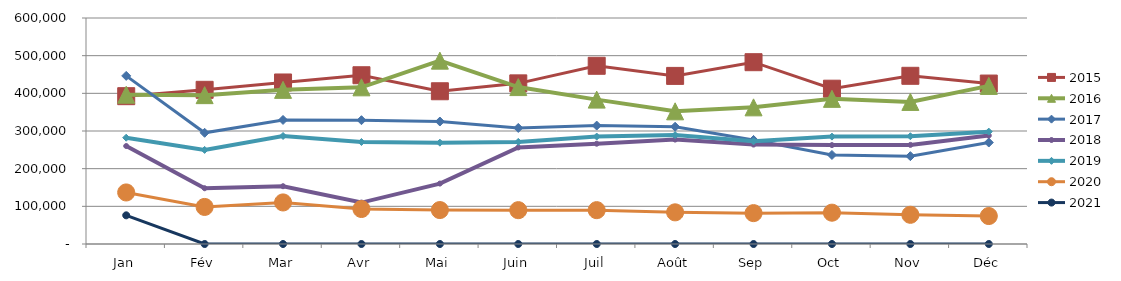
| Category | 2015 | 2016 | 2017 | 2018 | 2019 | 2020 | 2021 |
|---|---|---|---|---|---|---|---|
| Jan | 392455.386 | 396263.914 | 446281.806 | 260114.073 | 282172.738 | 136826.229 | 76108.624 |
| Fév | 409347.179 | 395175.975 | 295222.519 | 148036.843 | 249871.665 | 98396.552 | 0 |
| Mar | 428838.698 | 409222.091 | 329338.872 | 153395.928 | 286777.302 | 110314.836 | 0 |
| Avr | 448014.817 | 415901.642 | 328702.589 | 109982.902 | 270782.686 | 92890.727 | 0 |
| Mai | 405528.286 | 486763.336 | 325158.457 | 160382.707 | 269027.301 | 90121.405 | 0 |
| Juin | 426462.87 | 416602.613 | 308100.463 | 256426.409 | 271108.83 | 89786.547 | 0 |
| Juil | 473107.942 | 383313.72 | 314407.38 | 266269.669 | 285234.508 | 89814.637 | 0 |
| Août | 446267.927 | 352198.565 | 311304.785 | 277231.878 | 289072.19 | 84074.92 | 0 |
| Sep | 482677.503 | 362763.978 | 276260.727 | 263963.731 | 272549.159 | 81924.261 | 0 |
| Oct | 412311.701 | 385353.331 | 236379.756 | 262549.621 | 285123.451 | 83105.986 | 0 |
| Nov | 446526.169 | 377201.543 | 233251.128 | 263155.863 | 286119.242 | 77551.508 | 0 |
| Déc | 425963.85 | 419714.854 | 269424.356 | 287963.859 | 298314.346 | 74219.32 | 0 |